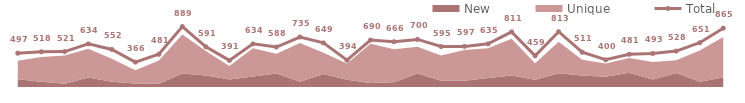
| Category | Total |
|---|---|
| 0 | 497 |
| 1 | 518 |
| 2 | 521 |
| 3 | 634 |
| 4 | 552 |
| 5 | 366 |
| 6 | 481 |
| 7 | 889 |
| 8 | 591 |
| 9 | 391 |
| 10 | 634 |
| 11 | 588 |
| 12 | 735 |
| 13 | 649 |
| 14 | 394 |
| 15 | 690 |
| 16 | 666 |
| 17 | 700 |
| 18 | 595 |
| 19 | 597 |
| 20 | 635 |
| 21 | 811 |
| 22 | 459 |
| 23 | 813 |
| 24 | 511 |
| 25 | 400 |
| 26 | 481 |
| 27 | 493 |
| 28 | 528 |
| 29 | 651 |
| 30 | 865 |